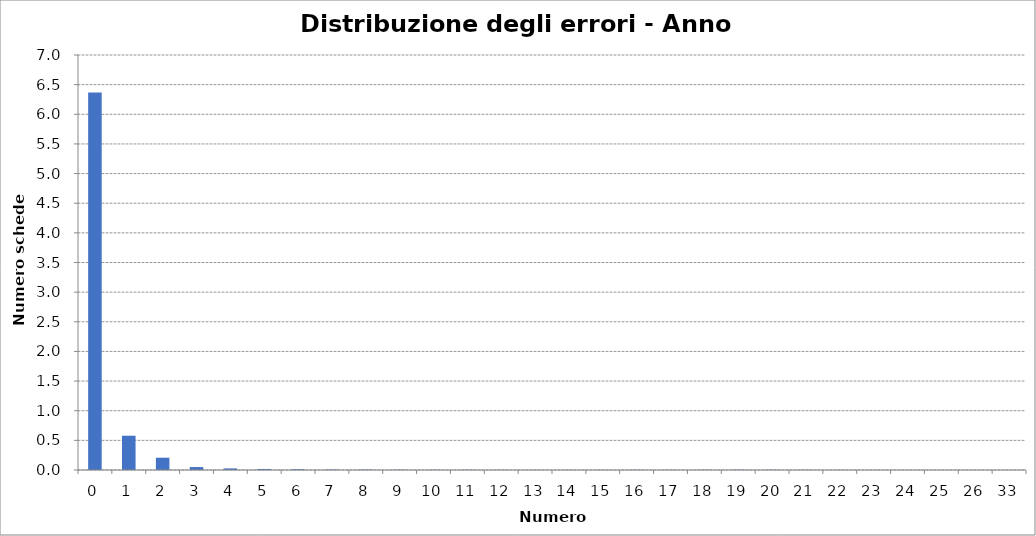
| Category | Series 0 |
|---|---|
| 0.0 | 6369184 |
| 1.0 | 577866 |
| 2.0 | 207330 |
| 3.0 | 49621 |
| 4.0 | 27090 |
| 5.0 | 17407 |
| 6.0 | 13040 |
| 7.0 | 7447 |
| 8.0 | 6344 |
| 9.0 | 4165 |
| 10.0 | 3659 |
| 11.0 | 3416 |
| 12.0 | 2605 |
| 13.0 | 1818 |
| 14.0 | 2152 |
| 15.0 | 2363 |
| 16.0 | 3022 |
| 17.0 | 2818 |
| 18.0 | 3939 |
| 19.0 | 4435 |
| 20.0 | 3866 |
| 21.0 | 2736 |
| 22.0 | 1746 |
| 23.0 | 690 |
| 24.0 | 107 |
| 25.0 | 5 |
| 26.0 | 2 |
| 33.0 | 1 |